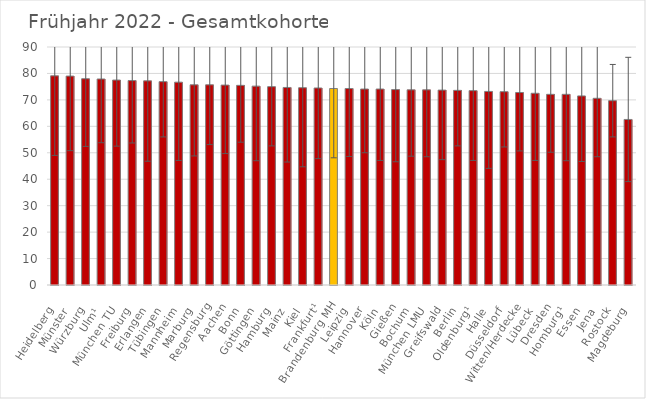
| Category | Mittelwert Ges |
|---|---|
| Heidelberg | 79.1 |
| Münster | 79 |
| Würzburg | 78 |
| Ulm¹ | 77.9 |
| München TU | 77.5 |
| Freiburg | 77.3 |
| Erlangen | 77.2 |
| Tübingen | 76.9 |
| Mannheim | 76.7 |
| Marburg | 75.7 |
| Regensburg | 75.7 |
| Aachen | 75.6 |
| Bonn | 75.5 |
| Göttingen | 75.2 |
| Hamburg | 75 |
| Mainz | 74.7 |
| Kiel | 74.6 |
| Frankfurt¹ | 74.5 |
| Brandenburg MH | 74.3 |
| Leipzig | 74.3 |
| Hannover | 74.1 |
| Köln | 74.1 |
| Gießen | 73.9 |
| Bochum | 73.8 |
| München LMU | 73.8 |
| Greifswald | 73.7 |
| Berlin | 73.6 |
| Oldenburg¹ | 73.5 |
| Halle | 73.2 |
| Düsseldorf | 73.1 |
| Witten/Herdecke | 72.8 |
| Lübeck | 72.5 |
| Dresden | 72.1 |
| Homburg¹ | 72.1 |
| Essen | 71.5 |
| Jena | 70.6 |
| Rostock | 69.7 |
| Magdeburg | 62.6 |